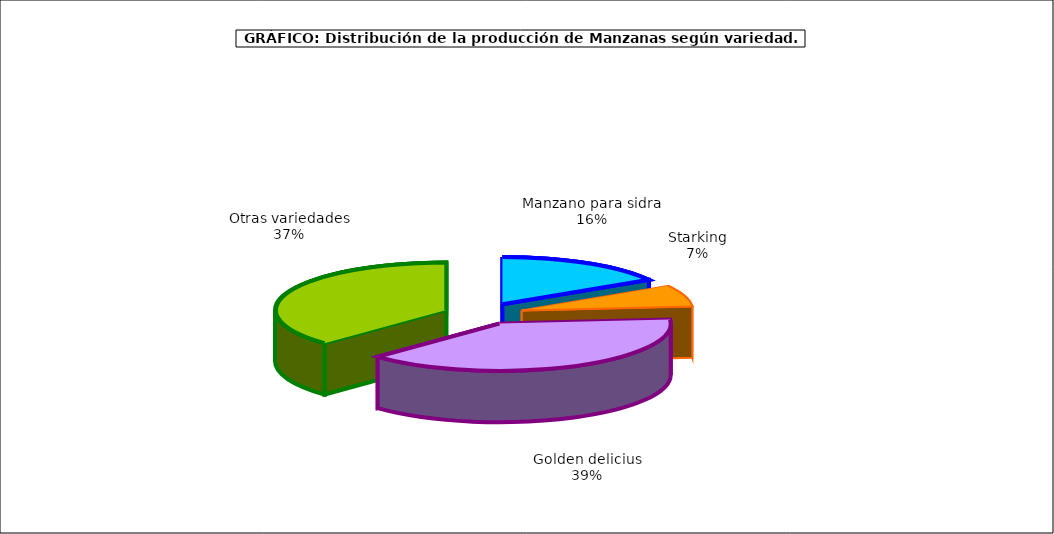
| Category | produccion |
|---|---|
| 0 | 100.756 |
| 1 | 45.154 |
| 2 | 240.293 |
| 3 | 230.892 |